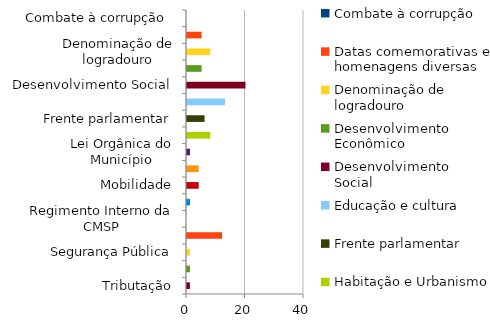
| Category | Projeto |
|---|---|
| Combate à corrupção  | 0 |
| Datas comemorativas e homenagens diversas | 5 |
| Denominação de logradouro | 8 |
| Desenvolvimento Econômico | 5 |
| Desenvolvimento Social  | 20 |
| Educação e cultura | 13 |
| Frente parlamentar | 6 |
| Habitação e Urbanismo | 8 |
| Lei Orgânica do Município | 1 |
| Meio ambiente ,  | 4 |
| Mobilidade | 4 |
| Proteção dos animais | 1 |
| Regimento Interno da CMSP | 0 |
| Saude-Esporte | 12 |
| Segurança Pública | 1 |
| Transparencia | 1 |
| Tributação | 1 |